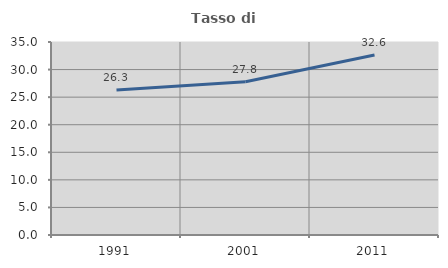
| Category | Tasso di occupazione   |
|---|---|
| 1991.0 | 26.298 |
| 2001.0 | 27.781 |
| 2011.0 | 32.643 |